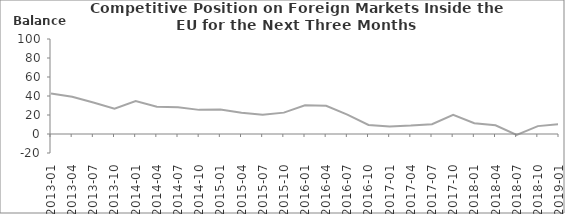
| Category | Balance |
|---|---|
| 2013-01 | 42.7 |
| 2013-04 | 39.2 |
| 2013-07 | 33.1 |
| 2013-10 | 26.6 |
| 2014-01 | 34.7 |
| 2014-04 | 28.7 |
| 2014-07 | 28.1 |
| 2014-10 | 25.4 |
| 2015-01 | 25.8 |
| 2015-04 | 22.3 |
| 2015-07 | 20.3 |
| 2015-10 | 22.5 |
| 2016-01 | 30.2 |
| 2016-04 | 29.7 |
| 2016-07 | 20.4 |
| 2016-10 | 9.5 |
| 2017-01 | 8 |
| 2017-04 | 8.9 |
| 2017-07 | 10.3 |
| 2017-10 | 20.1 |
| 2018-01 | 11.3 |
| 2018-04 | 9.2 |
| 2018-07 | -0.9 |
| 2018-10 | 8.3 |
| 2019-01 | 10.3 |